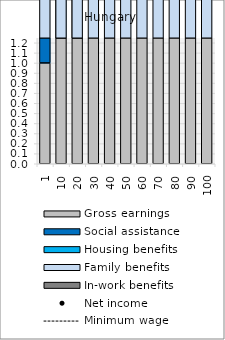
| Category | Gross earnings | Social assistance | Housing benefits | Family benefits | In-work benefits |
|---|---|---|---|---|---|
| 1.0 | 1 | 8.633 | 0 | 10.804 | 0 |
| 10.0 | 10 | 8.633 | 0 | 10.804 | 0 |
| 20.0 | 20 | 8.633 | 0 | 10.804 | 0 |
| 30.0 | 30 | 0 | 0 | 10.804 | 0 |
| 40.0 | 40 | 0 | 0 | 10.804 | 0 |
| 50.0 | 50 | 0 | 0 | 10.804 | 0 |
| 60.0 | 60 | 0 | 0 | 10.072 | 0 |
| 70.0 | 70 | 0 | 0 | 10.072 | 0 |
| 80.0 | 80 | 0 | 0 | 10.072 | 0 |
| 90.0 | 90 | 0 | 0 | 10.072 | 0 |
| 100.0 | 100 | 0 | 0 | 10.072 | 0 |